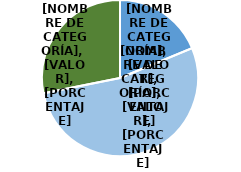
| Category | N° |
|---|---|
| Si | 12 |
| No | 34 |
| Sin información | 18 |